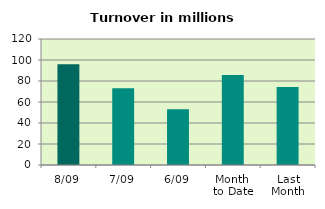
| Category | Series 0 |
|---|---|
| 8/09 | 96.004 |
| 7/09 | 73.043 |
| 6/09 | 53.003 |
| Month 
to Date | 85.775 |
| Last
Month | 74.221 |